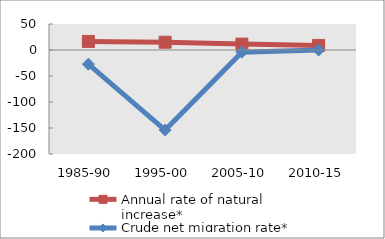
| Category | Annual rate of natural increase* | Crude net migration rate* |
|---|---|---|
| 1985-90 | 16.483 | -27.2 |
| 1995-00 | 14.959 | -153.911 |
| 2005-10 | 11.347 | -4.111 |
| 2010-15 | 8.807 | 0 |